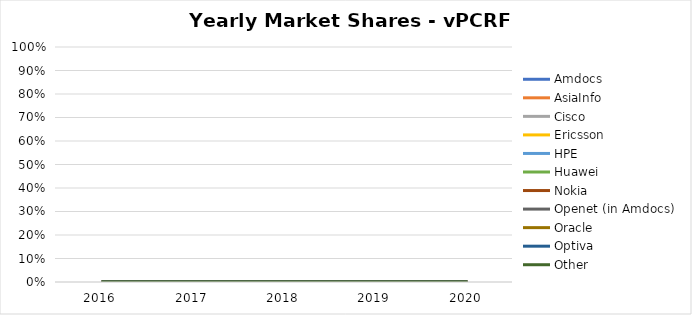
| Category | Amdocs | AsiaInfo | Cisco | Ericsson | HPE | Huawei | NEC Netcracker | Nokia | Openet (in Amdocs) | Oracle | Optiva | Other |
|---|---|---|---|---|---|---|---|---|---|---|---|---|
| 2016.0 | 0 | 0 | 0 | 0 | 0 | 0 | 0 | 0 | 0 | 0 | 0 | 0 |
| 2017.0 | 0 | 0 | 0 | 0 | 0 | 0 | 0 | 0 | 0 | 0 | 0 | 0 |
| 2018.0 | 0 | 0 | 0 | 0 | 0 | 0 | 0 | 0 | 0 | 0 | 0 | 0 |
| 2019.0 | 0 | 0 | 0 | 0 | 0 | 0 | 0 | 0 | 0 | 0 | 0 | 0 |
| 2020.0 | 0 | 0 | 0 | 0 | 0 | 0 | 0 | 0 | 0 | 0 | 0 | 0 |